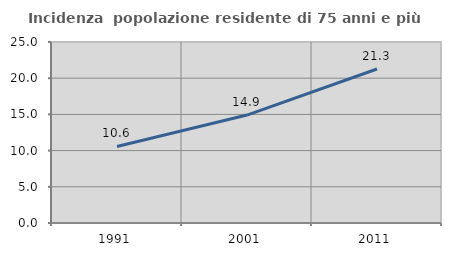
| Category | Incidenza  popolazione residente di 75 anni e più |
|---|---|
| 1991.0 | 10.573 |
| 2001.0 | 14.908 |
| 2011.0 | 21.272 |